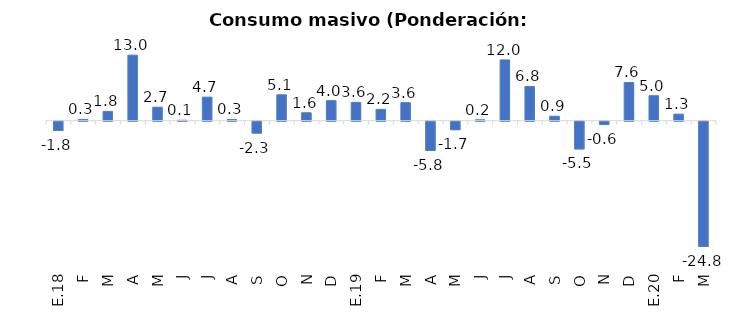
| Category | Consumo masivo (Ponderación: 39,4%) |
|---|---|
| E.18 | -1.84 |
| F | 0.268 |
| M | 1.849 |
| A | 12.989 |
| M | 2.683 |
| J | 0.094 |
| J | 4.675 |
| A | 0.25 |
| S | -2.349 |
| O | 5.141 |
| N | 1.579 |
| D | 3.978 |
| E.19 | 3.638 |
| F | 2.248 |
| M | 3.584 |
| A | -5.784 |
| M | -1.674 |
| J | 0.183 |
| J | 12.045 |
| A | 6.782 |
| S | 0.894 |
| O | -5.482 |
| N | -0.629 |
| D | 7.572 |
| E.20 | 4.961 |
| F | 1.3 |
| M | -24.8 |